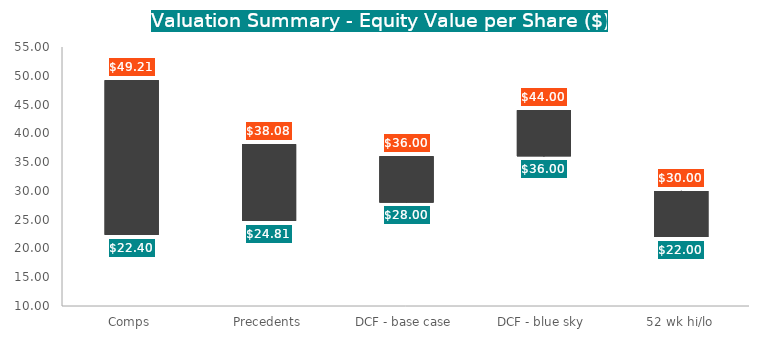
| Category | Series 0 | Series 1 | Series 2 | Series 3 |
|---|---|---|---|---|
| Comps | 22.395 | 22.395 | 49.211 | 49.211 |
| Precedents | 24.805 | 24.805 | 38.083 | 38.083 |
| DCF - base case | 28 | 28 | 36 | 36 |
| DCF - blue sky | 36 | 36 | 44 | 44 |
| 52 wk hi/lo | 22 | 22 | 30 | 30 |